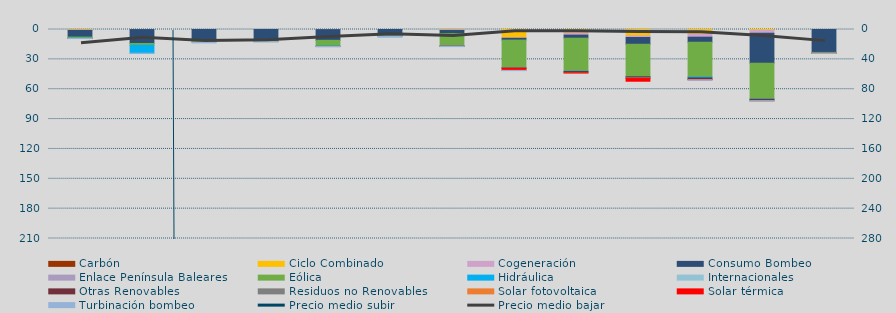
| Category | Carbón | Ciclo Combinado | Cogeneración | Consumo Bombeo | Enlace Península Baleares | Eólica | Hidráulica | Internacionales | Otras Renovables | Residuos no Renovables | Solar fotovoltaica | Solar térmica | Turbinación bombeo |
|---|---|---|---|---|---|---|---|---|---|---|---|---|---|
| 0 |  | 600 | 290.9 | 6727.7 |  | 1121.1 | 272.6 | 0 | 7.6 | 12.5 | 0.4 | 0 | 84 |
| 1 |  | 0 | 66 | 13968.1 |  | 1844.7 | 7917.4 | 0 | 0 | 0 | 0 | 0 | 46.9 |
| 2 |  | 0 | 13.8 | 11574.5 |  | 1255.7 | 0 | 313 | 0 | 0 | 0 | 0 | 240.1 |
| 3 |  | 0 | 0 | 11798.2 |  | 360.9 | 0 | 0 | 0 | 0 | 0 | 0 | 358.6 |
| 4 |  | 0 | 132.9 | 10732.4 |  | 5808.3 | 350.7 | 0 | 98.7 | 0 | 2.1 | 0 | 152.1 |
| 5 |  | 0 | 0 | 6311.1 |  | 429.6 | 2 | 0 | 0 | 0 | 0 | 0 | 1049.5 |
| 6 |  | 520 | 398.7 | 3208 |  | 12396.3 | 41.7 | 0 | 256.7 | 0 | 0.8 | 0 | 340.4 |
| 7 |  | 8320.6 | 532.5 | 1797.8 |  | 27746.3 | 146.7 | 0 | 300.2 | 0 | 250.5 | 1972.6 | 219.1 |
| 8 |  | 3526.6 | 2136.1 | 3089.7 |  | 32962.8 | 457 | 0 | 1325.6 | 0 | 38.1 | 15 | 0 |
| 9 |  | 6424.4 | 1632 | 6769.5 |  | 32546.8 | 161.3 | 0 | 1318.2 | 30.1 | 404.6 | 2687.6 | 0 |
| 10 |  | 4734 | 2991.4 | 5082.6 |  | 34919.2 | 974.6 | 0 | 1593 | 0 | 127.6 | 75.4 | 456.5 |
| 11 |  | 1002.5 | 2760.3 | 30103.8 |  | 35894 | 414.2 | 0 | 1401.5 | 0 | 44.9 | 0 | 291.7 |
| 12 |  | 0 | 0 | 23016.4 |  | 876.3 | 57 | 0 | 0 | 0 | 2.3 | 24.4 | 80 |